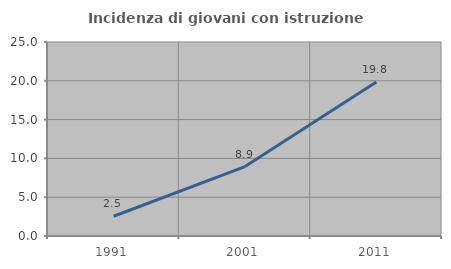
| Category | Incidenza di giovani con istruzione universitaria |
|---|---|
| 1991.0 | 2.545 |
| 2001.0 | 8.943 |
| 2011.0 | 19.841 |